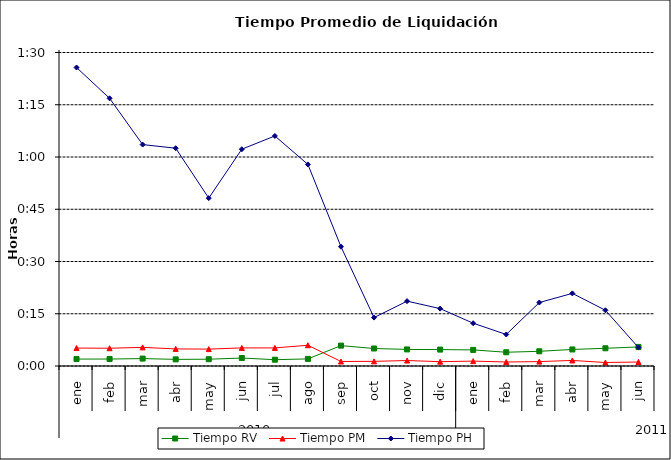
| Category | Tiempo RV | Tiempo PM | Tiempo PH |
|---|---|---|---|
| 0 | 0.001 | 0.004 | 0.06 |
| 1 | 0.001 | 0.004 | 0.053 |
| 2 | 0.001 | 0.004 | 0.044 |
| 3 | 0.001 | 0.003 | 0.043 |
| 4 | 0.001 | 0.003 | 0.033 |
| 5 | 0.002 | 0.004 | 0.043 |
| 6 | 0.001 | 0.004 | 0.046 |
| 7 | 0.001 | 0.004 | 0.04 |
| 8 | 0.004 | 0.001 | 0.024 |
| 9 | 0.003 | 0.001 | 0.01 |
| 10 | 0.003 | 0.001 | 0.013 |
| 11 | 0.003 | 0.001 | 0.011 |
| 12 | 0.003 | 0.001 | 0.009 |
| 13 | 0.003 | 0.001 | 0.006 |
| 14 | 0.003 | 0.001 | 0.013 |
| 15 | 0.003 | 0.001 | 0.014 |
| 16 | 0.004 | 0.001 | 0.011 |
| 17 | 0.004 | 0.001 | 0.004 |